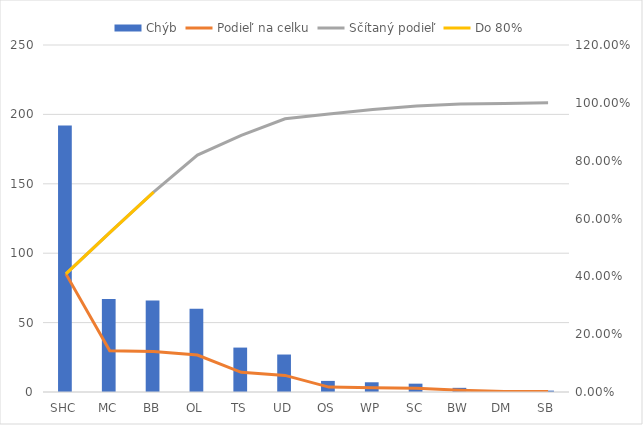
| Category | Chýb |
|---|---|
| SHC | 192 |
| MC | 67 |
| BB | 66 |
| OL | 60 |
| TS | 32 |
| UD | 27 |
| OS | 8 |
| WP | 7 |
| SC | 6 |
| BW | 3 |
| DM | 1 |
| SB | 1 |